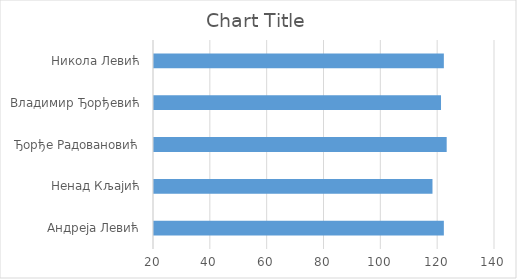
| Category | Series 0 |
|---|---|
| Андреја Левић | 122 |
| Ненад Кљајић | 118 |
| Ђорђе Радовановић | 123 |
| Владимир Ђорђевић | 121 |
| Никола Левић | 122 |